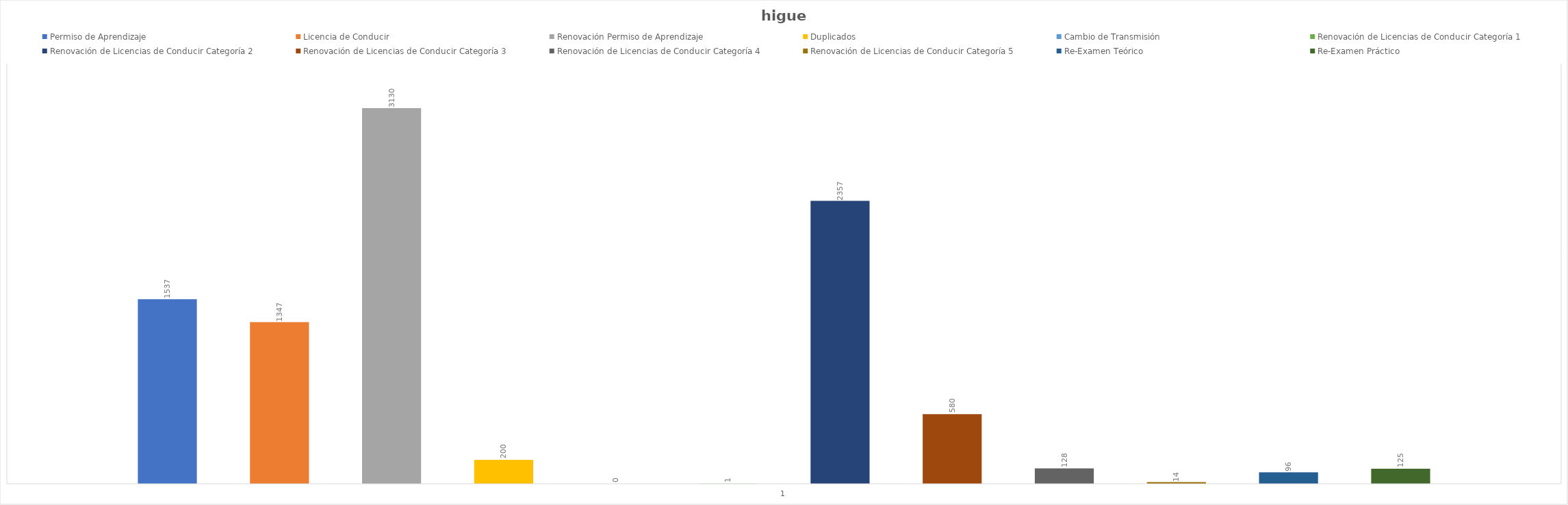
| Category | Permiso de Aprendizaje  | Licencia de Conducir  | Renovación Permiso de Aprendizaje | Duplicados  | Cambio de Transmisión  | Renovación de Licencias de Conducir Categoría 1 | Renovación de Licencias de Conducir Categoría 2 | Renovación de Licencias de Conducir Categoría 3 | Renovación de Licencias de Conducir Categoría 4 | Renovación de Licencias de Conducir Categoría 5 | Re-Examen Teórico | Re-Examen Práctico |
|---|---|---|---|---|---|---|---|---|---|---|---|---|
| 0 | 1537 | 1347 | 3130 | 200 | 0 | 1 | 2357 | 580 | 128 | 14 | 96 | 125 |